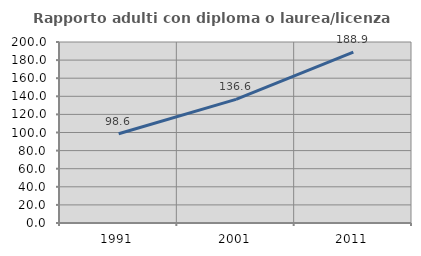
| Category | Rapporto adulti con diploma o laurea/licenza media  |
|---|---|
| 1991.0 | 98.617 |
| 2001.0 | 136.62 |
| 2011.0 | 188.908 |